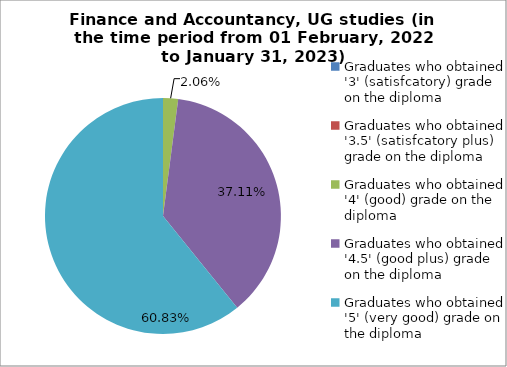
| Category | Series 0 |
|---|---|
| Graduates who obtained '3' (satisfcatory) grade on the diploma  | 0 |
| Graduates who obtained '3.5' (satisfcatory plus) grade on the diploma  | 0 |
| Graduates who obtained '4' (good) grade on the diploma  | 2.062 |
| Graduates who obtained '4.5' (good plus) grade on the diploma  | 37.113 |
| Graduates who obtained '5' (very good) grade on the diploma  | 60.825 |